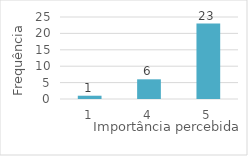
| Category | Series 0 |
|---|---|
| 1.0 | 1 |
| 4.0 | 6 |
| 5.0 | 23 |